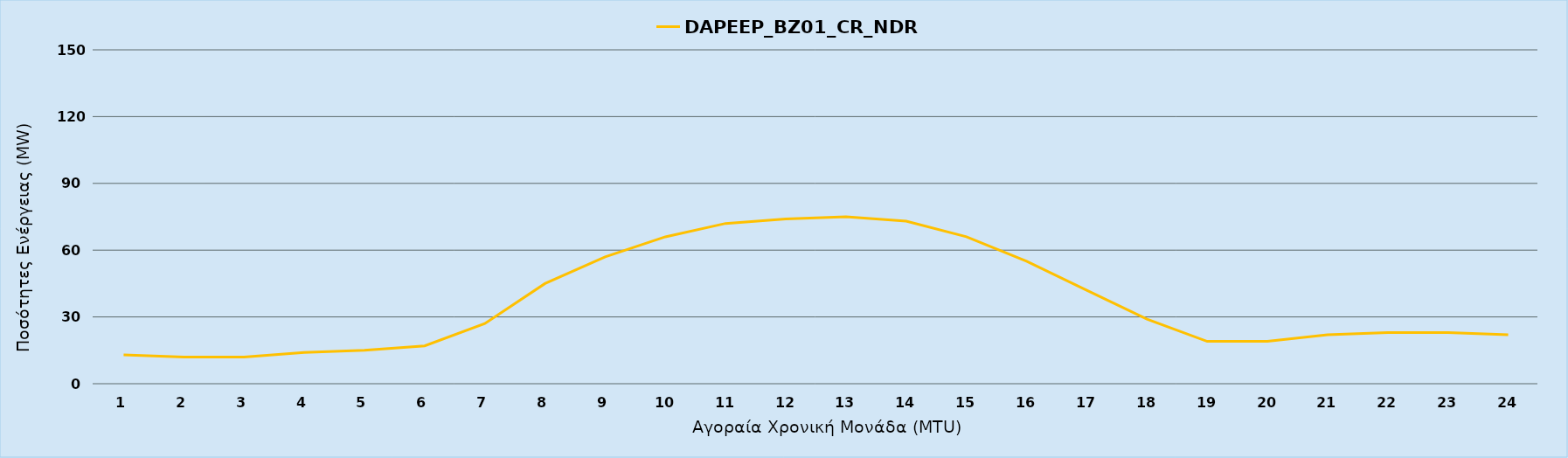
| Category | DAPEEP_BZ01_CR_NDR |
|---|---|
| 0 | 13 |
| 1 | 12 |
| 2 | 12 |
| 3 | 14 |
| 4 | 15 |
| 5 | 17 |
| 6 | 27 |
| 7 | 45 |
| 8 | 57 |
| 9 | 66 |
| 10 | 72 |
| 11 | 74 |
| 12 | 75 |
| 13 | 73 |
| 14 | 66 |
| 15 | 55 |
| 16 | 42 |
| 17 | 29 |
| 18 | 19 |
| 19 | 19 |
| 20 | 22 |
| 21 | 23 |
| 22 | 23 |
| 23 | 22 |